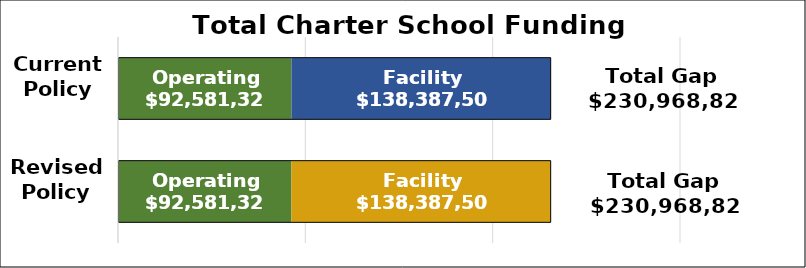
| Category | Operating | Facility |
|---|---|---|
| Current
Policy | 92581323.031 | 138387505.528 |
| Revised
Policy | 92581323.031 | 138387505.528 |